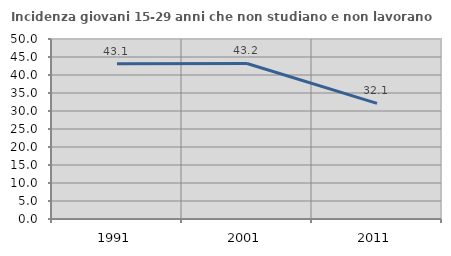
| Category | Incidenza giovani 15-29 anni che non studiano e non lavorano  |
|---|---|
| 1991.0 | 43.125 |
| 2001.0 | 43.197 |
| 2011.0 | 32.101 |